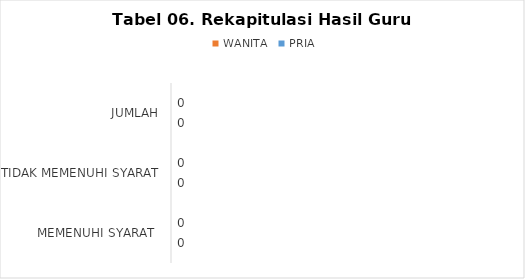
| Category | PRIA  | WANITA |
|---|---|---|
| MEMENUHI SYARAT  | 0 | 0 |
| TIDAK MEMENUHI SYARAT | 0 | 0 |
| JUMLAH | 0 | 0 |